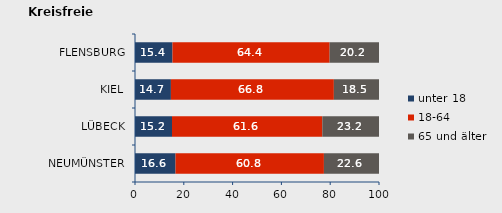
| Category | unter 18 | 18-64 | 65 und älter |
|---|---|---|---|
| NEUMÜNSTER | 16.606 | 60.819 | 22.575 |
| LÜBECK | 15.164 | 61.615 | 23.22 |
| KIEL | 14.717 | 66.786 | 18.497 |
| FLENSBURG | 15.362 | 64.405 | 20.233 |